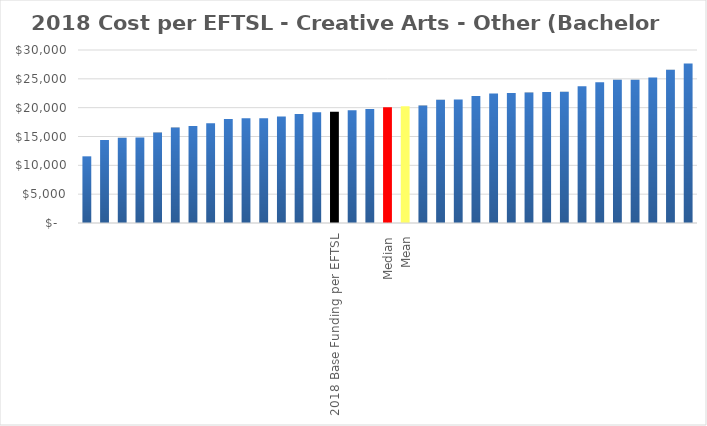
| Category | Series 0 |
|---|---|
|  | 11562.984 |
|  | 14397.748 |
|  | 14804.478 |
|  | 14826.313 |
|  | 15690.101 |
|  | 16544.046 |
|  | 16809.281 |
|  | 17280.22 |
|  | 18034.538 |
|  | 18158.062 |
|  | 18158.787 |
|  | 18488.065 |
|  | 18911.313 |
|  | 19210.902 |
| 2018 Base Funding per EFTSL | 19274 |
|  | 19543.587 |
|  | 19767.798 |
| Median | 20069.833 |
| Mean | 20244.4 |